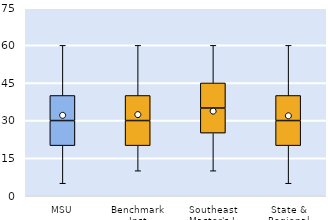
| Category | 25th | 50th | 75th |
|---|---|---|---|
| MSU | 20 | 10 | 10 |
| Benchmark Inst | 20 | 10 | 10 |
| Southeast Master's-L | 25 | 10 | 10 |
| State & Regional | 20 | 10 | 10 |